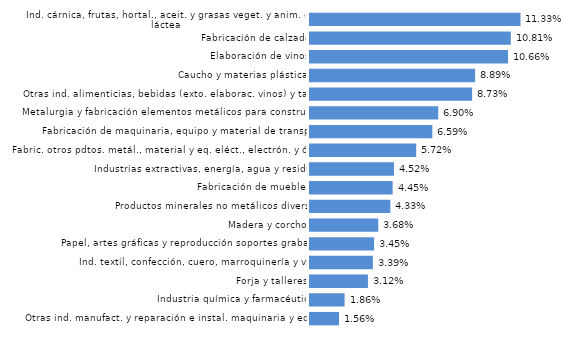
| Category | La Rioja |
|---|---|
| Otras ind. manufact. y reparación e instal. maquinaria y equipo | 0.016 |
| Industria química y farmacéutica | 0.019 |
| Forja y talleres | 0.031 |
| Ind. textil, confección, cuero, marroquinería y viaje | 0.034 |
| Papel, artes gráficas y reproducción soportes grabados | 0.035 |
| Madera y corcho | 0.037 |
| Productos minerales no metálicos diversos | 0.043 |
| Fabricación de muebles | 0.045 |
| Industrias extractivas, energía, agua y residuos | 0.045 |
| Fabric. otros pdtos. metál., material y eq. eléct., electrón. y óptico | 0.057 |
| Fabricación de maquinaria, equipo y material de transporte | 0.066 |
| Metalurgia y fabricación elementos metálicos para construcción | 0.069 |
| Otras ind. alimenticias, bebidas (exto. elaborac. vinos) y tabaco | 0.087 |
| Caucho y materias plásticas | 0.089 |
| Elaboración de vinos | 0.107 |
| Fabricación de calzado | 0.108 |
| Ind. cárnica, frutas, hortal., aceit. y grasas veget. y anim. e ind. láctea | 0.113 |